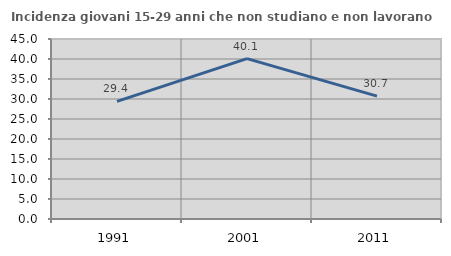
| Category | Incidenza giovani 15-29 anni che non studiano e non lavorano  |
|---|---|
| 1991.0 | 29.397 |
| 2001.0 | 40.104 |
| 2011.0 | 30.726 |